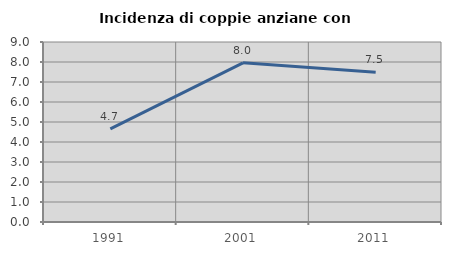
| Category | Incidenza di coppie anziane con figli |
|---|---|
| 1991.0 | 4.659 |
| 2001.0 | 7.959 |
| 2011.0 | 7.483 |